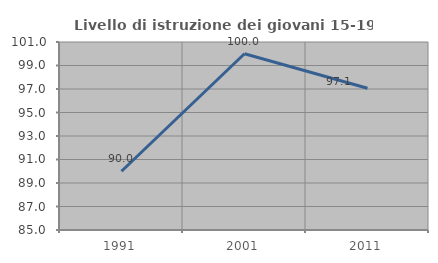
| Category | Livello di istruzione dei giovani 15-19 anni |
|---|---|
| 1991.0 | 90 |
| 2001.0 | 100 |
| 2011.0 | 97.059 |